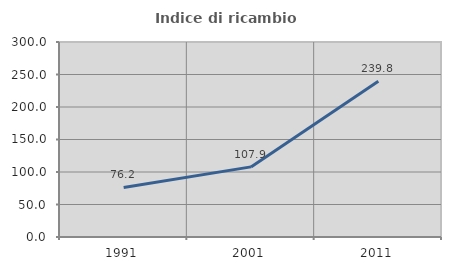
| Category | Indice di ricambio occupazionale  |
|---|---|
| 1991.0 | 76.178 |
| 2001.0 | 107.865 |
| 2011.0 | 239.75 |